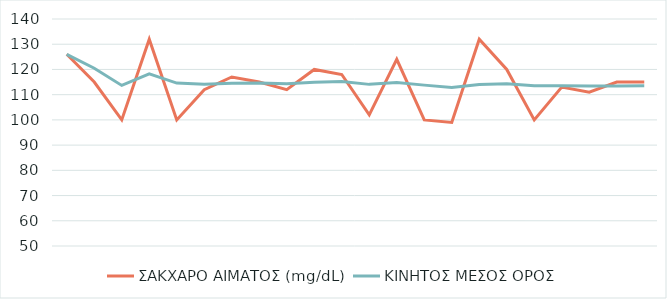
| Category | ΣΑΚΧΑΡΟ ΑΙΜΑΤΟΣ (mg/dL) | ΚΙΝΗΤΟΣ ΜΕΣΟΣ ΟΡΟΣ |
|---|---|---|
| 0 | 126 | 126 |
| 1 | 115 | 120.5 |
| 2 | 100 | 113.667 |
| 3 | 132 | 118.25 |
| 4 | 100 | 114.6 |
| 5 | 112 | 114.167 |
| 6 | 117 | 114.571 |
| 7 | 115 | 114.625 |
| 8 | 112 | 114.333 |
| 9 | 120 | 114.9 |
| 10 | 118 | 115.182 |
| 11 | 102 | 114.083 |
| 12 | 124 | 114.846 |
| 13 | 100 | 113.786 |
| 14 | 99 | 112.8 |
| 15 | 132 | 114 |
| 16 | 120 | 114.353 |
| 17 | 100 | 113.556 |
| 18 | 113 | 113.526 |
| 19 | 111 | 113.4 |
| 20 | 115 | 113.476 |
| 21 | 115 | 113.545 |